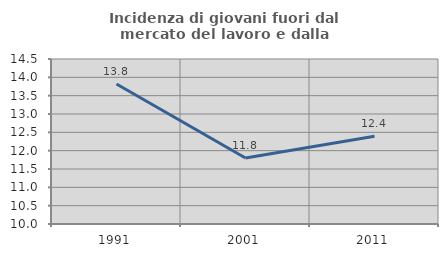
| Category | Incidenza di giovani fuori dal mercato del lavoro e dalla formazione  |
|---|---|
| 1991.0 | 13.817 |
| 2001.0 | 11.799 |
| 2011.0 | 12.393 |